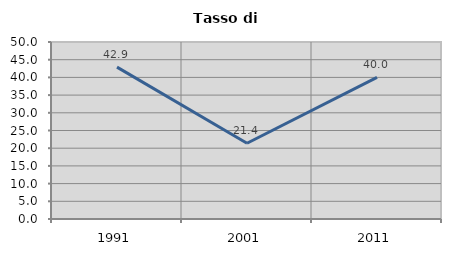
| Category | Tasso di disoccupazione   |
|---|---|
| 1991.0 | 42.908 |
| 2001.0 | 21.393 |
| 2011.0 | 40 |